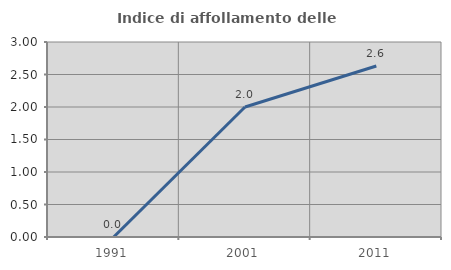
| Category | Indice di affollamento delle abitazioni  |
|---|---|
| 1991.0 | 0 |
| 2001.0 | 2 |
| 2011.0 | 2.632 |